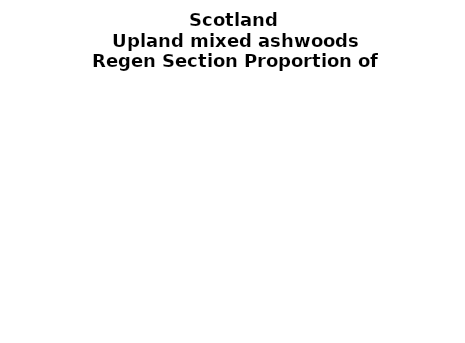
| Category | Upland mixed ashwoods |
|---|---|
| None | 0.068 |
| Seedlings only | 0 |
| Seedlings, saplings only | 0.012 |
| Seedlings, saplings, <7 cm trees | 0.077 |
| Saplings only | 0.273 |
| <7 cm trees, seedlings only | 0 |
| <7 cm trees, saplings only | 0.368 |
| <7 cm Trees only | 0.202 |